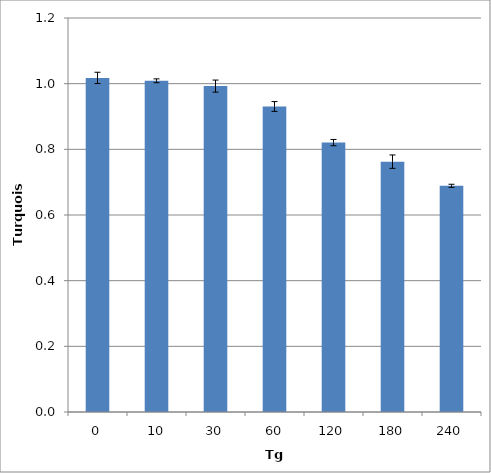
| Category | Turquoise |
|---|---|
| 0.0 | 1.018 |
| 10.0 | 1.009 |
| 30.0 | 0.993 |
| 60.0 | 0.93 |
| 120.0 | 0.821 |
| 180.0 | 0.762 |
| 240.0 | 0.689 |